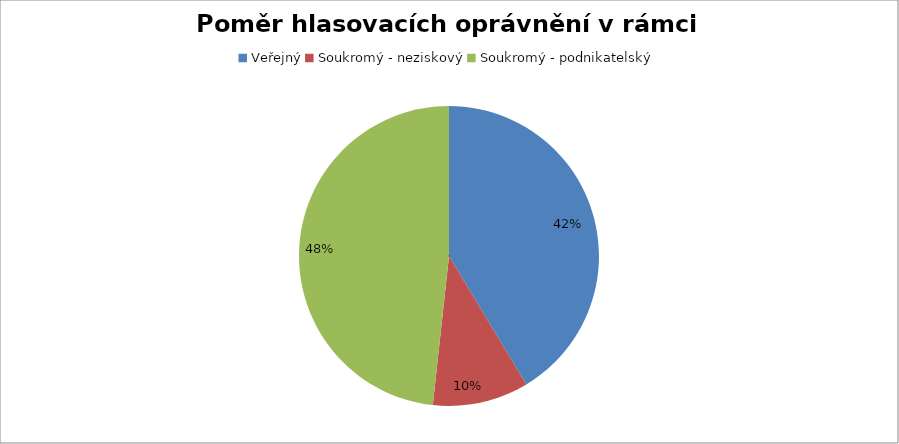
| Category | Series 0 |
|---|---|
| Veřejný | 0.414 |
| Soukromý - neziskový | 0.103 |
| Soukromý - podnikatelský | 0.483 |